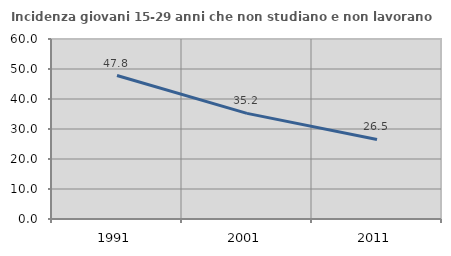
| Category | Incidenza giovani 15-29 anni che non studiano e non lavorano  |
|---|---|
| 1991.0 | 47.829 |
| 2001.0 | 35.202 |
| 2011.0 | 26.514 |